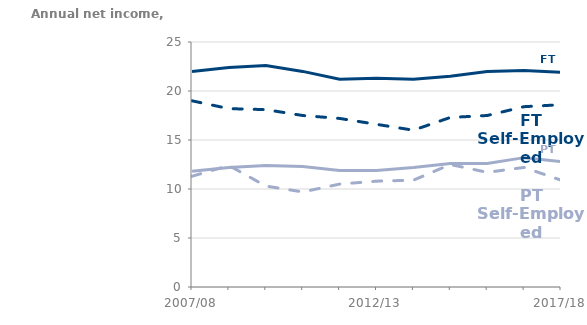
| Category | Full-Time Employees | Part-Time Self-employed | Full-Time Self-Employed | Part-Time Employees |
|---|---|---|---|---|
| 2007/08 | 22000 | 11300 | 19000 | 11800 |
| 2008/09 | 22400 | 12400 | 18200 | 12200 |
| 2009/10 | 22600 | 10300 | 18100 | 12400 |
| 2010/11 | 22000 | 9700 | 17500 | 12300 |
| 2011/12 | 21200 | 10500 | 17200 | 11900 |
| 2012/13 | 21300 | 10800 | 16600 | 11900 |
| 2013/14 | 21200 | 10900 | 16000 | 12200 |
| 2014/15 | 21500 | 12500 | 17300 | 12600 |
| 2015/16 | 22000 | 11700 | 17500 | 12600 |
| 2016/17 | 22100 | 12200 | 18400 | 13200 |
| 2017/18 | 21900 | 10900 | 18600 | 12800 |